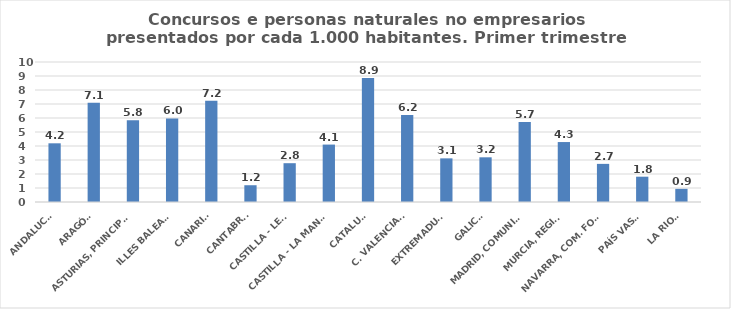
| Category | 616 |
|---|---|
| ANDALUCÍA | 4.192 |
| ARAGÓN | 7.092 |
| ASTURIAS, PRINCIPADO | 5.833 |
| ILLES BALEARS | 5.971 |
| CANARIAS | 7.23 |
| CANTABRIA | 1.198 |
| CASTILLA - LEÓN | 2.772 |
| CASTILLA - LA MANCHA | 4.102 |
| CATALUÑA | 8.857 |
| C. VALENCIANA | 6.219 |
| EXTREMADURA | 3.117 |
| GALICIA | 3.192 |
| MADRID, COMUNIDAD | 5.722 |
| MURCIA, REGIÓN | 4.282 |
| NAVARRA, COM. FORAL | 2.723 |
| PAÍS VASCO | 1.808 |
| LA RIOJA | 0.94 |